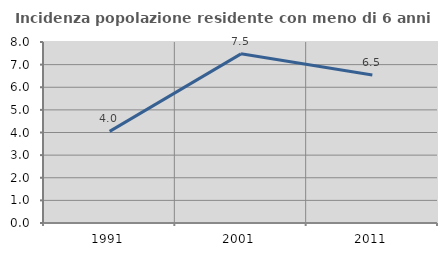
| Category | Incidenza popolazione residente con meno di 6 anni |
|---|---|
| 1991.0 | 4.049 |
| 2001.0 | 7.477 |
| 2011.0 | 6.54 |